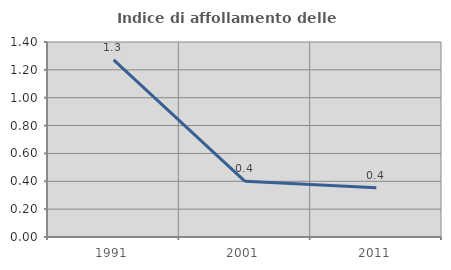
| Category | Indice di affollamento delle abitazioni  |
|---|---|
| 1991.0 | 1.271 |
| 2001.0 | 0.4 |
| 2011.0 | 0.353 |